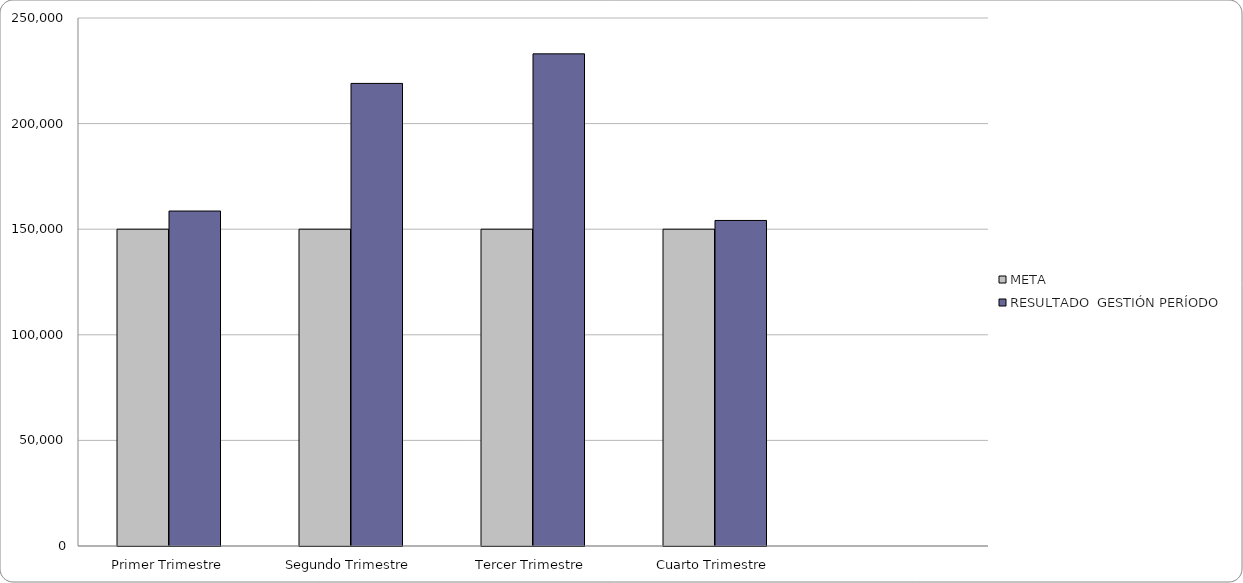
| Category | META | RESULTADO  GESTIÓN PERÍODO |
|---|---|---|
| Primer Trimestre | 150000 | 158601 |
| Segundo Trimestre | 150000 | 219030 |
| Tercer Trimestre | 150000 | 233022 |
| Cuarto Trimestre | 150000 | 154135 |